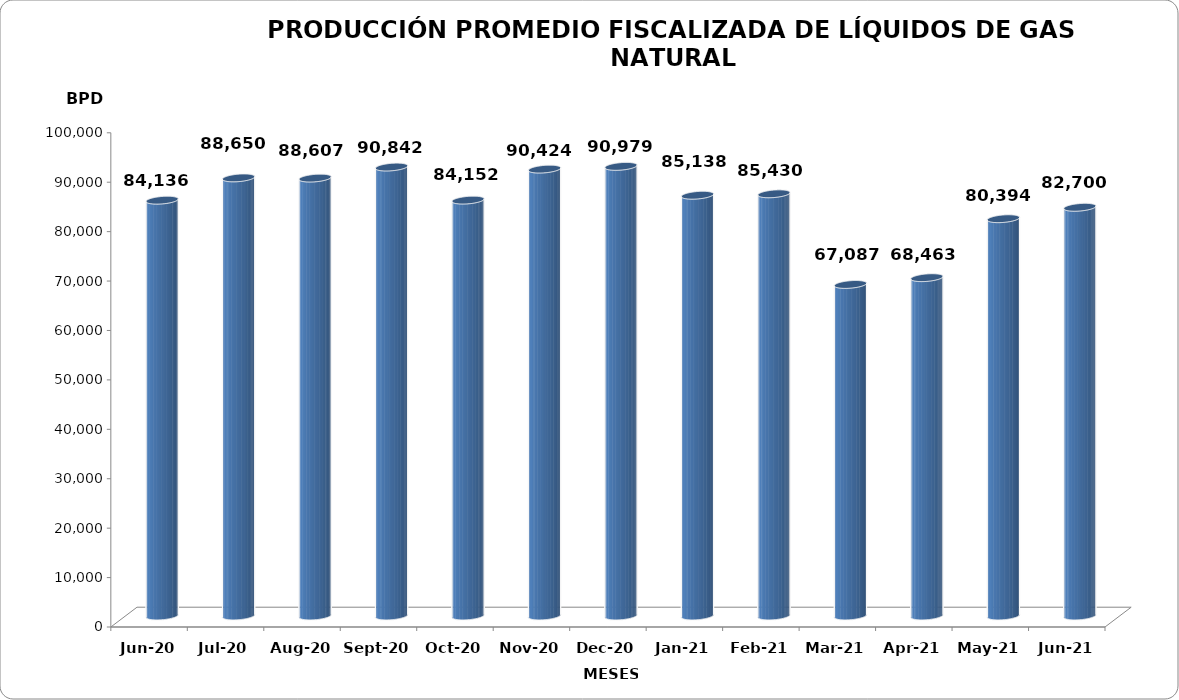
| Category | Series 0 |
|---|---|
| 2020-06-01 | 84136 |
| 2020-07-01 | 88650 |
| 2020-08-01 | 88607 |
| 2020-09-01 | 90842 |
| 2020-10-01 | 84152 |
| 2020-11-01 | 90424 |
| 2020-12-01 | 90979 |
| 2021-01-01 | 85138 |
| 2021-02-01 | 85430 |
| 2021-03-01 | 67087 |
| 2021-04-01 | 68463 |
| 2021-05-01 | 80393.645 |
| 2021-06-01 | 82699.833 |